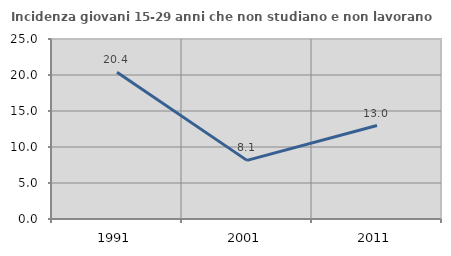
| Category | Incidenza giovani 15-29 anni che non studiano e non lavorano  |
|---|---|
| 1991.0 | 20.385 |
| 2001.0 | 8.144 |
| 2011.0 | 12.984 |